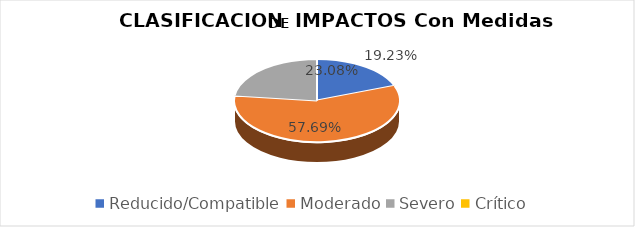
| Category | Series 0 |
|---|---|
| Reducido/Compatible | 0.192 |
| Moderado | 0.577 |
| Severo | 0.231 |
| Crítico | 0 |